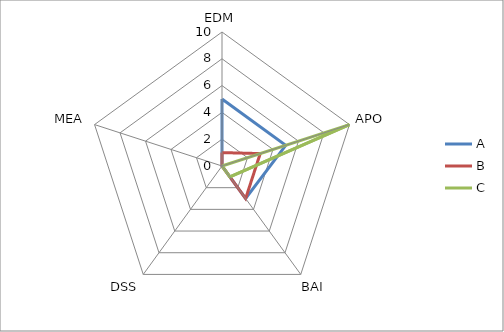
| Category | A | B | C |
|---|---|---|---|
| 0 | 5 | 1 | 0 |
| 1 | 5 | 3 | 10 |
| 2 | 3 | 3 | 1 |
| 3 | 0 | 0 | 0 |
| 4 | 0 | 0 | 0 |